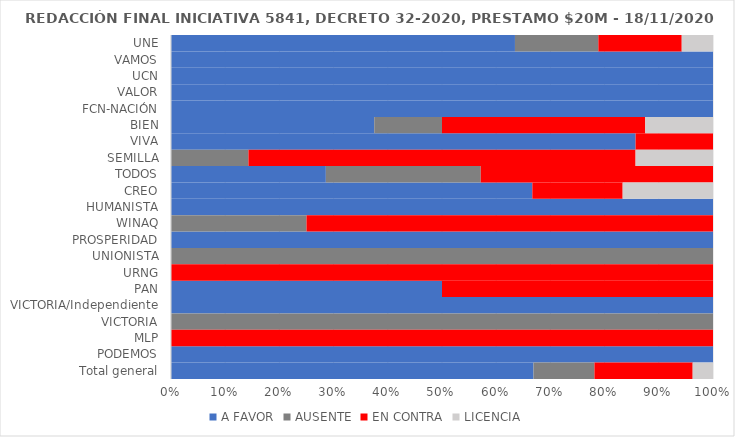
| Category | A FAVOR | AUSENTE | EN CONTRA | LICENCIA |
|---|---|---|---|---|
| UNE | 0.635 | 0.154 | 0.154 | 0.058 |
| VAMOS | 1 | 0 | 0 | 0 |
| UCN | 1 | 0 | 0 | 0 |
| VALOR | 1 | 0 | 0 | 0 |
| FCN-NACIÓN | 1 | 0 | 0 | 0 |
| BIEN | 0.375 | 0.125 | 0.375 | 0.125 |
| VIVA | 0.857 | 0 | 0.143 | 0 |
| SEMILLA | 0 | 0.143 | 0.714 | 0.143 |
| TODOS | 0.286 | 0.286 | 0.429 | 0 |
| CREO | 0.667 | 0 | 0.167 | 0.167 |
| HUMANISTA | 1 | 0 | 0 | 0 |
| WINAQ | 0 | 0.25 | 0.75 | 0 |
| PROSPERIDAD | 1 | 0 | 0 | 0 |
| UNIONISTA | 0 | 1 | 0 | 0 |
| URNG | 0 | 0 | 1 | 0 |
| PAN | 0.5 | 0 | 0.5 | 0 |
| VICTORIA/Independiente | 1 | 0 | 0 | 0 |
| VICTORIA | 0 | 1 | 0 | 0 |
| MLP | 0 | 0 | 1 | 0 |
| PODEMOS | 1 | 0 | 0 | 0 |
| Total general | 0.669 | 0.112 | 0.181 | 0.038 |